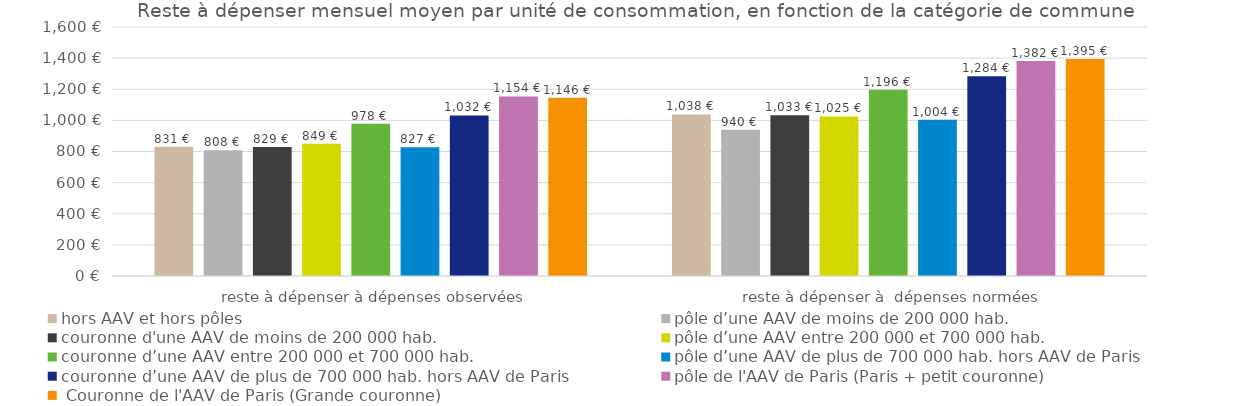
| Category | hors AAV et hors pôles | pôle d’une AAV de moins de 200 000 hab. | couronne d'une AAV de moins de 200 000 hab. | pôle d’une AAV entre 200 000 et 700 000 hab. | couronne d’une AAV entre 200 000 et 700 000 hab. | pôle d’une AAV de plus de 700 000 hab. hors AAV de Paris | couronne d’une AAV de plus de 700 000 hab. hors AAV de Paris | pôle de l'AAV de Paris (Paris + petit couronne) |  Couronne de l'AAV de Paris (Grande couronne) |
|---|---|---|---|---|---|---|---|---|---|
| reste à dépenser à dépenses observées | 831 | 808 | 829 | 849 | 978 | 827 | 1032 | 1154 | 1146 |
| reste à dépenser à  dépenses normées | 1038 | 940 | 1033 | 1025 | 1196 | 1004 | 1284 | 1382 | 1395 |